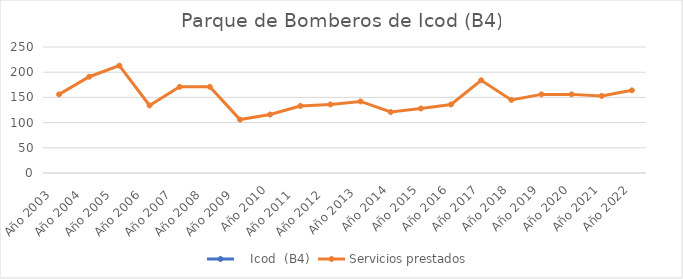
| Category |    Icod  (B4) | Servicios prestados  |
|---|---|---|
| Año 2003   |  | 156 |
| Año 2004   |  | 191 |
| Año 2005   |  | 213 |
| Año 2006   |  | 134 |
| Año 2007   |  | 171 |
| Año 2008   |  | 171 |
| Año 2009   |  | 106 |
| Año 2010 |  | 116 |
| Año 2011   |  | 133 |
| Año 2012   |  | 136 |
| Año 2013  |  | 142 |
| Año 2014 |  | 121 |
| Año 2015 |  | 128 |
| Año 2016 |  | 136 |
| Año 2017 |  | 184 |
| Año 2018 |  | 145 |
| Año 2019 |  | 156 |
| Año 2020 |  | 156 |
| Año 2021 |  | 153 |
| Año 2022 |  | 164 |